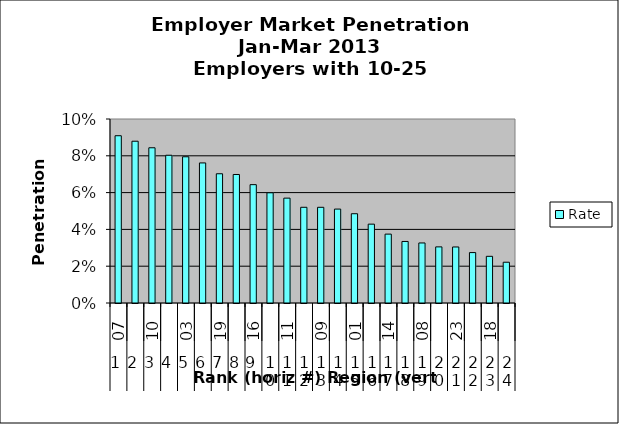
| Category | Rate |
|---|---|
| 0 | 0.091 |
| 1 | 0.088 |
| 2 | 0.084 |
| 3 | 0.08 |
| 4 | 0.079 |
| 5 | 0.076 |
| 6 | 0.07 |
| 7 | 0.07 |
| 8 | 0.064 |
| 9 | 0.06 |
| 10 | 0.057 |
| 11 | 0.052 |
| 12 | 0.052 |
| 13 | 0.051 |
| 14 | 0.049 |
| 15 | 0.043 |
| 16 | 0.037 |
| 17 | 0.033 |
| 18 | 0.033 |
| 19 | 0.03 |
| 20 | 0.03 |
| 21 | 0.027 |
| 22 | 0.025 |
| 23 | 0.022 |